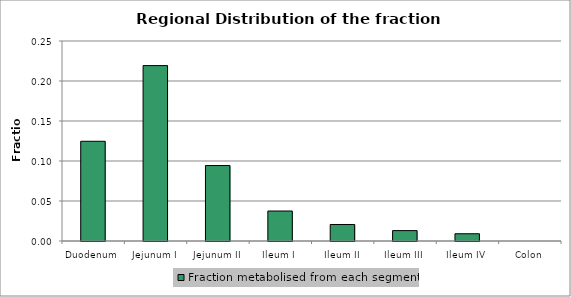
| Category | Fraction metabolised from each segment |
|---|---|
| Duodenum | 0.125 |
| Jejunum I | 0.219 |
| Jejunum II | 0.094 |
| Ileum I | 0.037 |
| Ileum II | 0.021 |
| Ileum III | 0.013 |
| Ileum IV | 0.009 |
| Colon | 0 |